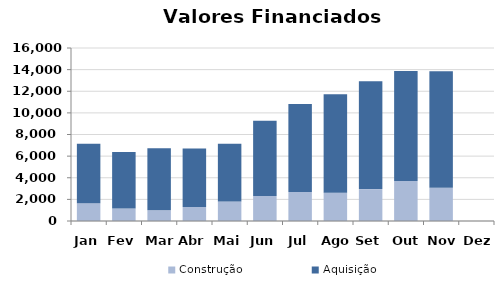
| Category | Construção | Aquisição  |
|---|---|---|
| Jan | 1647.218 | 5494.876 |
| Fev | 1152.824 | 5222.822 |
| Mar | 988.527 | 5741.891 |
| Abr | 1298.638 | 5402.188 |
| Mai | 1814.008 | 5319.9 |
| Jun | 2314.503 | 6953.565 |
| Jul | 2686.171 | 8133.926 |
| Ago | 2622.976 | 9096.504 |
| Set | 2949.608 | 9963.791 |
| Out | 3700.874 | 10163.207 |
| Nov | 3068.989 | 10771.163 |
| Dez | 0 | 0 |